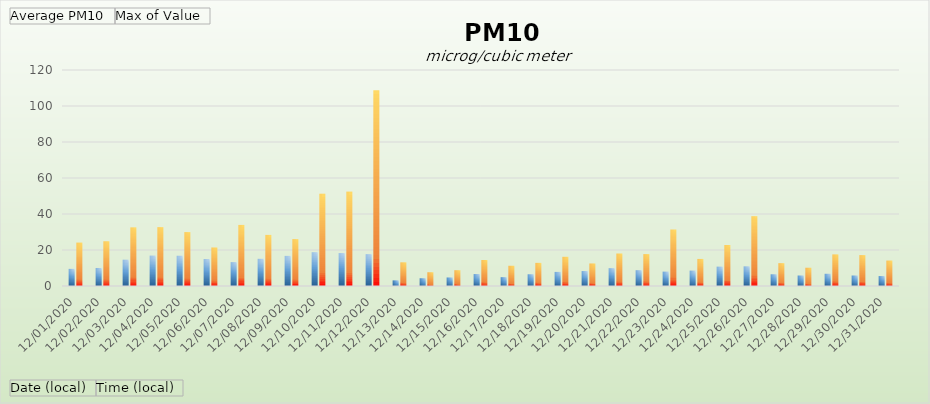
| Category | Average PM10 | Max of Value |
|---|---|---|
| 12/01/2020 | 9.532 | 24.13 |
| 12/02/2020 | 10.019 | 24.865 |
| 12/03/2020 | 14.637 | 32.583 |
| 12/04/2020 | 16.908 | 32.712 |
| 12/05/2020 | 16.821 | 29.96 |
| 12/06/2020 | 14.983 | 21.414 |
| 12/07/2020 | 13.273 | 33.937 |
| 12/08/2020 | 15.114 | 28.404 |
| 12/09/2020 | 16.743 | 26.062 |
| 12/10/2020 | 18.79 | 51.287 |
| 12/11/2020 | 18.301 | 52.462 |
| 12/12/2020 | 17.708 | 108.782 |
| 12/13/2020 | 3.139 | 13.167 |
| 12/14/2020 | 4.312 | 7.657 |
| 12/15/2020 | 4.744 | 8.79 |
| 12/16/2020 | 6.642 | 14.436 |
| 12/17/2020 | 4.913 | 11.25 |
| 12/18/2020 | 6.53 | 12.862 |
| 12/19/2020 | 7.842 | 16.237 |
| 12/20/2020 | 8.301 | 12.538 |
| 12/21/2020 | 9.913 | 18.055 |
| 12/22/2020 | 8.787 | 17.728 |
| 12/23/2020 | 7.997 | 31.4 |
| 12/24/2020 | 8.568 | 15.044 |
| 12/25/2020 | 10.775 | 22.793 |
| 12/26/2020 | 10.936 | 38.794 |
| 12/27/2020 | 6.527 | 12.702 |
| 12/28/2020 | 5.842 | 10.165 |
| 12/29/2020 | 6.802 | 17.573 |
| 12/30/2020 | 5.845 | 17.179 |
| 12/31/2020 | 5.528 | 14.149 |